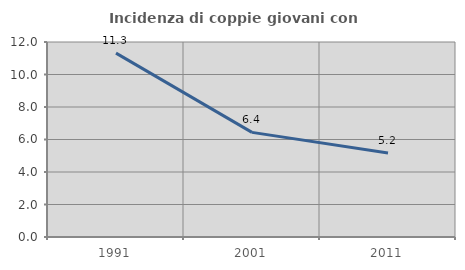
| Category | Incidenza di coppie giovani con figli |
|---|---|
| 1991.0 | 11.315 |
| 2001.0 | 6.438 |
| 2011.0 | 5.171 |